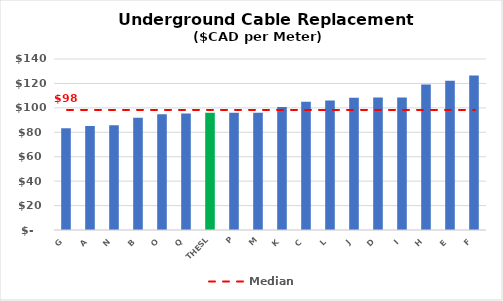
| Category | Series 0 |
|---|---|
| G | 83.257 |
| A | 85.212 |
| N | 85.79 |
| B | 91.985 |
| O | 94.788 |
| Q | 95.421 |
| THESL | 96 |
| P | 96.051 |
| M | 96.061 |
| K | 100.623 |
| C | 105.09 |
| L | 105.985 |
| J | 108.18 |
| D | 108.406 |
| I | 108.577 |
| H | 119.032 |
| E | 122.212 |
| F | 126.404 |